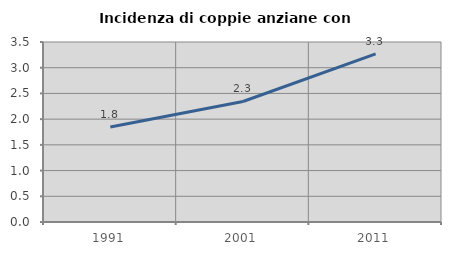
| Category | Incidenza di coppie anziane con figli |
|---|---|
| 1991.0 | 1.848 |
| 2001.0 | 2.344 |
| 2011.0 | 3.268 |